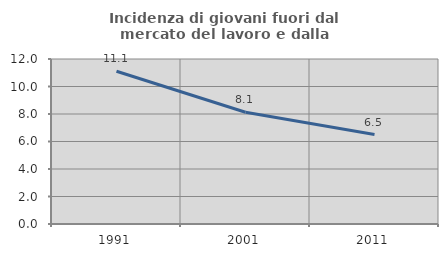
| Category | Incidenza di giovani fuori dal mercato del lavoro e dalla formazione  |
|---|---|
| 1991.0 | 11.111 |
| 2001.0 | 8.125 |
| 2011.0 | 6.509 |